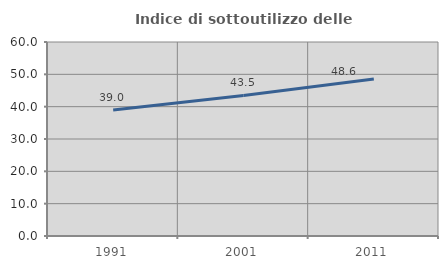
| Category | Indice di sottoutilizzo delle abitazioni  |
|---|---|
| 1991.0 | 38.965 |
| 2001.0 | 43.462 |
| 2011.0 | 48.583 |